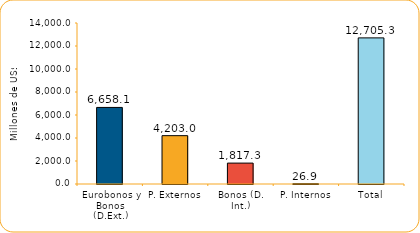
| Category | Series 1 |
|---|---|
| Eurobonos y Bonos (D.Ext.) | 6658.1 |
| P. Externos | 4203 |
| Bonos (D. Int.) | 1817.3 |
| P. Internos | 26.9 |
| Total | 12705.3 |